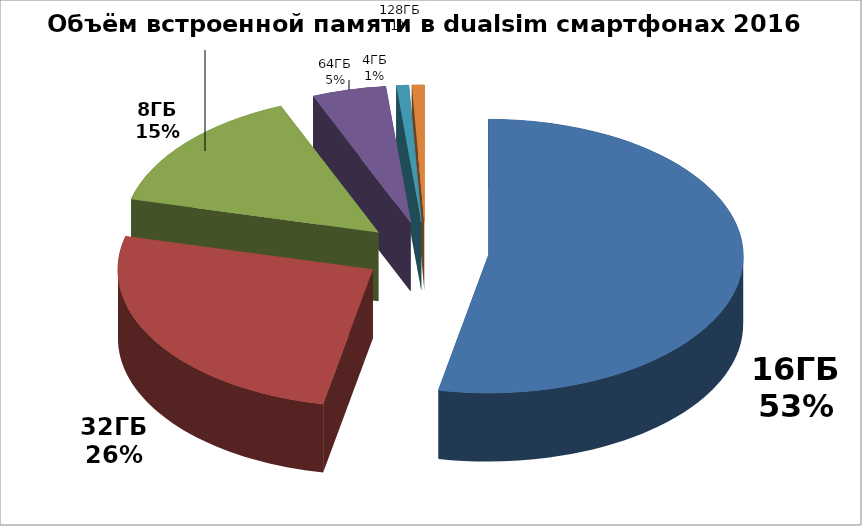
| Category | Series 0 |
|---|---|
| 16ГБ | 68 |
| 32ГБ | 33 |
| 8ГБ | 19 |
| 64ГБ | 6 |
| 4ГБ | 1 |
| 128ГБ | 1 |